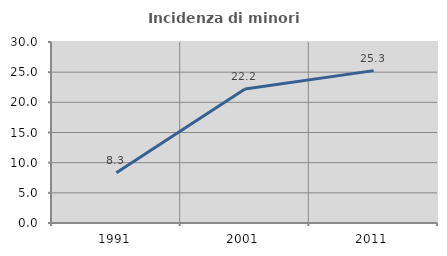
| Category | Incidenza di minori stranieri |
|---|---|
| 1991.0 | 8.333 |
| 2001.0 | 22.222 |
| 2011.0 | 25.258 |